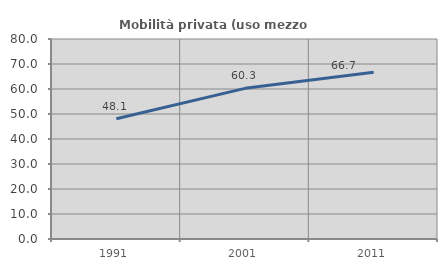
| Category | Mobilità privata (uso mezzo privato) |
|---|---|
| 1991.0 | 48.093 |
| 2001.0 | 60.258 |
| 2011.0 | 66.722 |